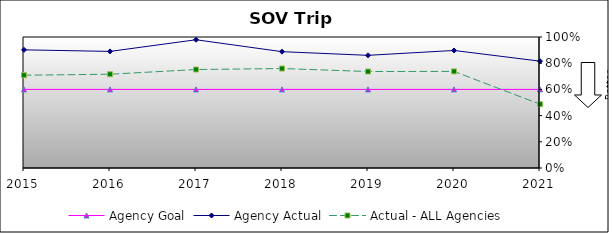
| Category | Agency Goal | Agency Actual | Actual - ALL Agencies |
|---|---|---|---|
| 2015.0 | 0.6 | 0.902 | 0.708 |
| 2016.0 | 0.6 | 0.89 | 0.716 |
| 2017.0 | 0.6 | 0.979 | 0.752 |
| 2018.0 | 0.6 | 0.888 | 0.759 |
| 2019.0 | 0.6 | 0.86 | 0.736 |
| 2020.0 | 0.6 | 0.897 | 0.737 |
| 2021.0 | 0.6 | 0.816 | 0.487 |